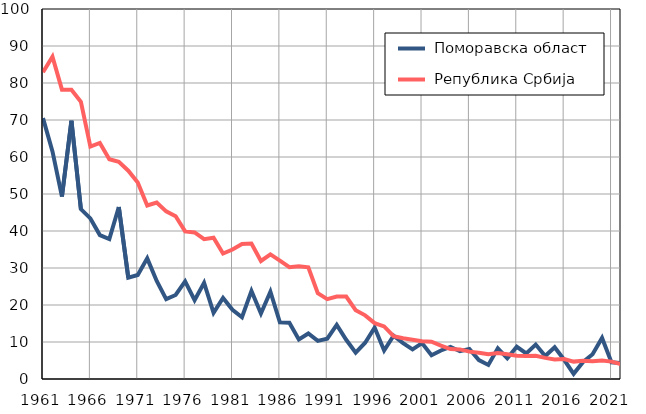
| Category |  Поморавска област |  Република Србија |
|---|---|---|
| 1961.0 | 70.5 | 82.9 |
| 1962.0 | 61.5 | 87.1 |
| 1963.0 | 49.3 | 78.2 |
| 1964.0 | 69.8 | 78.2 |
| 1965.0 | 45.9 | 74.9 |
| 1966.0 | 43.4 | 62.8 |
| 1967.0 | 38.9 | 63.8 |
| 1968.0 | 37.8 | 59.4 |
| 1969.0 | 46.5 | 58.7 |
| 1970.0 | 27.4 | 56.3 |
| 1971.0 | 28.1 | 53.1 |
| 1972.0 | 32.6 | 46.9 |
| 1973.0 | 26.5 | 47.7 |
| 1974.0 | 21.6 | 45.3 |
| 1975.0 | 22.7 | 44 |
| 1976.0 | 26.4 | 39.9 |
| 1977.0 | 21.3 | 39.6 |
| 1978.0 | 26 | 37.8 |
| 1979.0 | 17.9 | 38.2 |
| 1980.0 | 21.9 | 33.9 |
| 1981.0 | 18.7 | 35 |
| 1982.0 | 16.7 | 36.5 |
| 1983.0 | 23.8 | 36.6 |
| 1984.0 | 17.7 | 31.9 |
| 1985.0 | 23.6 | 33.7 |
| 1986.0 | 15.3 | 32 |
| 1987.0 | 15.2 | 30.2 |
| 1988.0 | 10.7 | 30.5 |
| 1989.0 | 12.3 | 30.2 |
| 1990.0 | 10.3 | 23.2 |
| 1991.0 | 10.9 | 21.6 |
| 1992.0 | 14.6 | 22.3 |
| 1993.0 | 10.6 | 22.3 |
| 1994.0 | 7.1 | 18.6 |
| 1995.0 | 9.8 | 17.2 |
| 1996.0 | 13.9 | 15.1 |
| 1997.0 | 7.7 | 14.2 |
| 1998.0 | 11.7 | 11.6 |
| 1999.0 | 9.7 | 11 |
| 2000.0 | 8 | 10.6 |
| 2001.0 | 9.7 | 10.2 |
| 2002.0 | 6.4 | 10.1 |
| 2003.0 | 7.7 | 9 |
| 2004.0 | 8.7 | 8.1 |
| 2005.0 | 7.5 | 8 |
| 2006.0 | 8.1 | 7.4 |
| 2007.0 | 5.1 | 7.1 |
| 2008.0 | 3.8 | 6.7 |
| 2009.0 | 8.3 | 7 |
| 2010.0 | 5.6 | 6.7 |
| 2011.0 | 8.7 | 6.3 |
| 2012.0 | 6.9 | 6.2 |
| 2013.0 | 9.3 | 6.3 |
| 2014.0 | 6.2 | 5.7 |
| 2015.0 | 8.6 | 5.3 |
| 2016.0 | 5.2 | 5.4 |
| 2017.0 | 1.4 | 4.7 |
| 2018.0 | 4.6 | 4.9 |
| 2019.0 | 6.7 | 4.8 |
| 2020.0 | 11.1 | 5 |
| 2021.0 | 4.5 | 4.7 |
| 2022.0 | 4.3 | 4 |